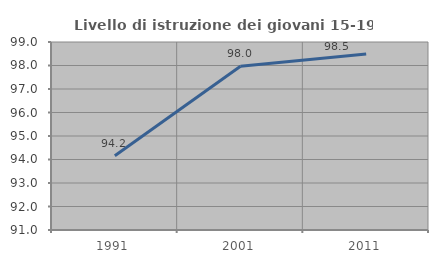
| Category | Livello di istruzione dei giovani 15-19 anni |
|---|---|
| 1991.0 | 94.161 |
| 2001.0 | 97.97 |
| 2011.0 | 98.492 |